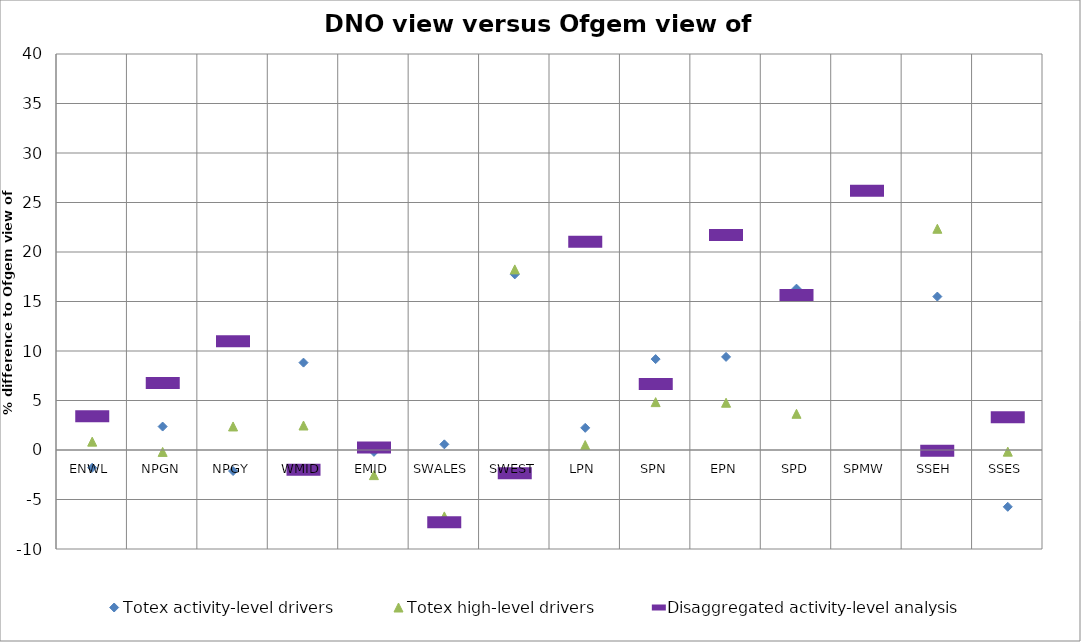
| Category | Totex activity-level drivers | Totex high-level drivers | Disaggregated activity-level analysis |
|---|---|---|---|
| ENWL | -1.792 | 0.845 | 3.404 |
| NPGN | 2.368 | -0.194 | 6.778 |
| NPGY | -2.124 | 2.377 | 10.976 |
| WMID | 8.826 | 2.473 | -2.007 |
| EMID | -0.19 | -2.537 | 0.243 |
| SWALES | 0.571 | -6.707 | -7.292 |
| SWEST | 17.738 | 18.242 | -2.341 |
| LPN | 2.239 | 0.499 | 21.037 |
| SPN | 9.182 | 4.836 | 6.678 |
| EPN | 9.404 | 4.775 | 21.715 |
| SPD | 16.298 | 3.658 | 15.644 |
| SPMW | 49.521 | 58.572 | 26.194 |
| SSEH | 15.498 | 22.347 | -0.081 |
| SSES | -5.74 | -0.166 | 3.317 |